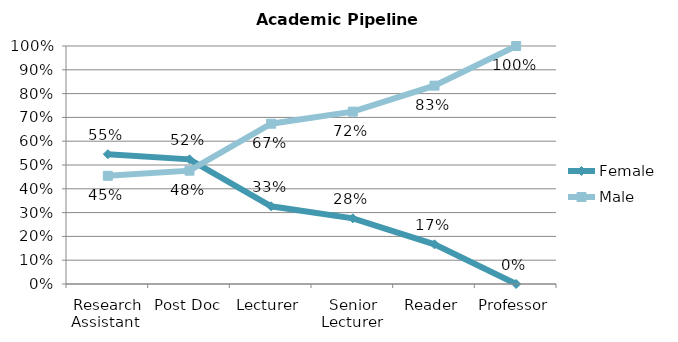
| Category | Female  | Male |
|---|---|---|
| Research Assistant  | 0.545 | 0.455 |
| Post Doc | 0.524 | 0.476 |
| Lecturer | 0.327 | 0.673 |
| Senior Lecturer | 0.276 | 0.724 |
| Reader | 0.167 | 0.833 |
| Professor | 0 | 1 |